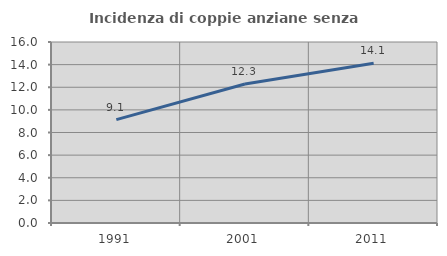
| Category | Incidenza di coppie anziane senza figli  |
|---|---|
| 1991.0 | 9.135 |
| 2001.0 | 12.29 |
| 2011.0 | 14.125 |